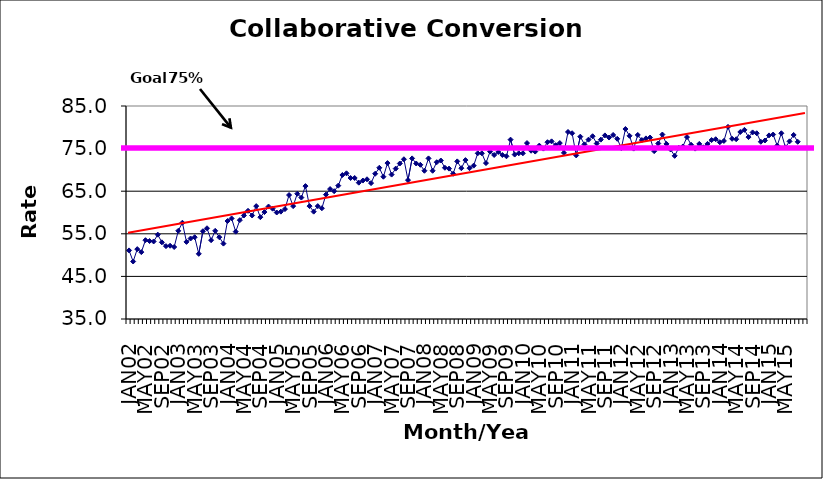
| Category | Series 0 |
|---|---|
| JAN02 | 51.1 |
| FEB02 | 48.5 |
| MAR02 | 51.4 |
| APR02 | 50.7 |
| MAY02 | 53.5 |
| JUN02 | 53.3 |
| JUL02 | 53.2 |
| AUG02 | 54.8 |
| SEP02 | 53 |
| OCT02 | 52.1 |
| NOV02 | 52.2 |
| DEC02 | 51.9 |
| JAN03 | 55.7 |
| FEB03 | 57.6 |
| MAR03 | 53.1 |
| APR03 | 53.9 |
| MAY03 | 54.2 |
| JUN03 | 50.3 |
| JUL03 | 55.6 |
| AUG03 | 56.3 |
| SEP03 | 53.5 |
| OCT03 | 55.7 |
| NOV03 | 54.2 |
| DEC03 | 52.7 |
| JAN04 | 58 |
| FEB04 | 58.6 |
| MAR04 | 55.5 |
| APR04 | 58.2 |
| MAY04 | 59.3 |
| JUN04 | 60.4 |
| JUL04 | 59.3 |
| AUG04 | 61.5 |
| SEP04 | 58.9 |
| OCT04 | 60.1 |
| NOV04 | 61.4 |
| DEC04 | 60.9 |
| JAN05 | 60 |
| FEB05 | 60.2 |
| MAR05 | 60.8 |
| APR05 | 64.1 |
| MAY05 | 61.5 |
| JUN05 | 64.4 |
| JUL05 | 63.5 |
| AUG05 | 66.2 |
| SEP05 | 61.5 |
| OCT05 | 60.2 |
| NOV05 | 61.5 |
| DEC05 | 61 |
| JAN06 | 64.2 |
| FEB06 | 65.5 |
| MAR06 | 65 |
| APR06 | 66.3 |
| MAY06 | 68.8 |
| JUN06 | 69.2 |
| JUL06 | 68.1 |
| AUG06 | 68.1 |
| SEP06 | 67 |
| OCT06 | 67.5 |
| NOV06 | 67.8 |
| DEC06 | 66.9 |
| JAN07 | 69.1 |
| FEB07 | 70.5 |
| MAR07 | 68.4 |
| APR07 | 71.6 |
| MAY07 | 68.9 |
| JUN07 | 70.3 |
| JUL07 | 71.5 |
| AUG07 | 72.5 |
| SEP07 | 67.6 |
| OCT07 | 72.7 |
| NOV07 | 71.5 |
| DEC07 | 71.2 |
| JAN08 | 69.8 |
| FEB08 | 72.7 |
| MAR08 | 69.8 |
| APR08 | 71.8 |
| MAY08 | 72.2 |
| JUN08 | 70.5 |
| JUL08 | 70.3 |
| AUG08 | 69.1 |
| SEP08 | 72 |
| OCT08 | 70.4 |
| NOV08 | 72.3 |
| DEC08 | 70.4 |
| JAN09 | 71 |
| FEB09 | 73.9 |
| MAR09 | 73.9 |
| APR09 | 71.6 |
| MAY09 | 74.3 |
| JUN09 | 73.5 |
| JUL09 | 74.2 |
| AUG09 | 73.5 |
| SEP09 | 73.2 |
| OCT09 | 77.1 |
| NOV09 | 73.6 |
| DEC09 | 73.9 |
| JAN10 | 73.9 |
| FEB10 | 76.3 |
| MAR10 | 74.5 |
| APR10 | 74.3 |
| MAY10 | 75.7 |
| JUN10 | 75 |
| JUL10 | 76.5 |
| AUG10 | 76.7 |
| SEP10 | 75.8 |
| OCT10 | 76.3 |
| NOV10 | 74 |
| DEC10 | 78.9 |
| JAN11 | 78.6 |
| FEB11 | 73.4 |
| MAR11 | 77.8 |
| APR11 | 76 |
| MAY11 | 77.1 |
| JUN11 | 77.9 |
| JUL11 | 76.2 |
| AUG11 | 77.1 |
| SEP11 | 78.1 |
| OCT11 | 77.6 |
| NOV11 | 78.2 |
| DEC11 | 77.3 |
| JAN12 | 75.1 |
| FEB12 | 79.6 |
| MAR12 | 78 |
| APR12 | 75 |
| MAY12 | 78.2 |
| JUN12 | 77 |
| JUL12 | 77.4 |
| AUG12 | 77.6 |
| SEP12 | 74.4 |
| OCT12 | 76.2 |
| NOV12 | 78.3 |
| DEC12 | 76.1 |
| JAN13 | 74.8 |
| FEB13 | 73.3 |
| MAR13 | 75.2 |
| APR13 | 75.5 |
| MAY13 | 77.7 |
| JUN13 | 75.9 |
| JUL13 | 75 |
| AUG13 | 76.1 |
| SEP13 | 75.3 |
| OCT13 | 76.1 |
| NOV13 | 77 |
| DEC13 | 77.2 |
| JAN14 | 76.5 |
| FEB14 | 76.8 |
| MAR14 | 80.1 |
| APR14 | 77.3 |
| MAY14 | 77.2 |
| JUN14 | 78.9 |
| JUL14 | 79.4 |
| AUG14 | 77.7 |
| SEP14 | 78.8 |
| OCT14 | 78.6 |
| NOV14 | 76.6 |
| DEC14 | 76.9 |
| JAN15 | 78.1 |
| FEB15 | 78.3 |
| MAR15 | 75.7 |
| APR15 | 78.6 |
| MAY15 | 75.3 |
| JUN15 | 76.7 |
| JUL15 | 78.2 |
| AUG15 | 76.6 |